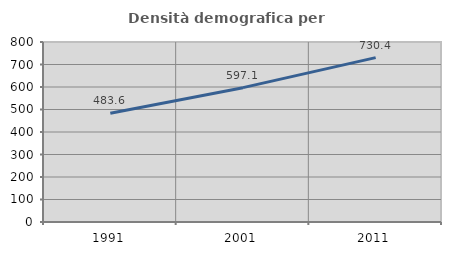
| Category | Densità demografica |
|---|---|
| 1991.0 | 483.573 |
| 2001.0 | 597.074 |
| 2011.0 | 730.414 |